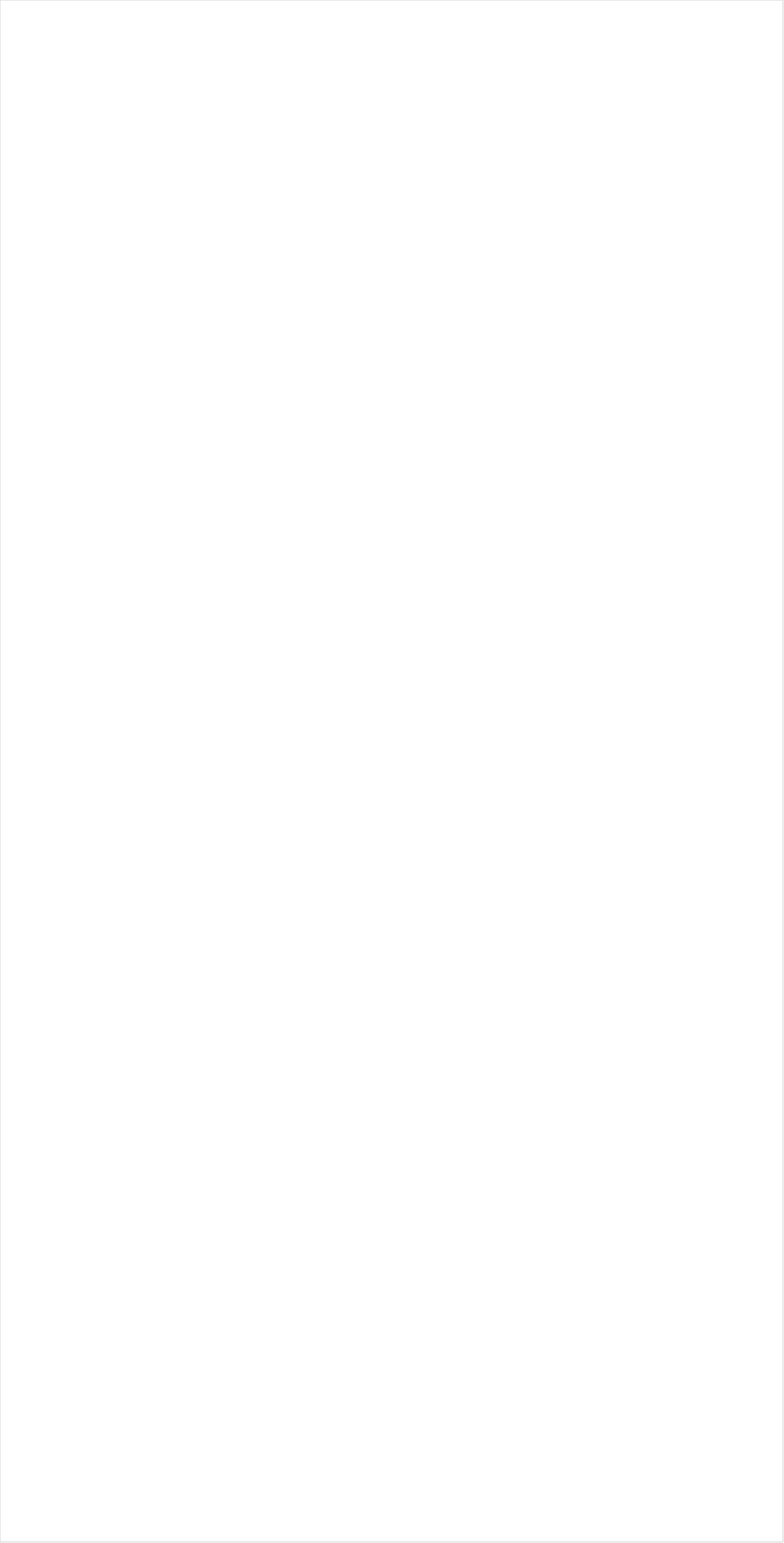
| Category | Total |
|---|---|
| Galavision | -0.932 |
| Telemundo | -0.908 |
| TUDN | -0.906 |
| UniMas | -0.892 |
| Univision | -0.822 |
| BET Her | -0.79 |
| NBC Universo | -0.774 |
| MTV2 | -0.754 |
| BET | -0.663 |
| TV ONE | -0.625 |
| MyNetworkTV | -0.579 |
| VH1 | -0.57 |
| NBA TV | -0.51 |
| Nick Toons | -0.495 |
| MSNBC | -0.455 |
| Nick Jr. | -0.441 |
| Oprah Winfrey Network | -0.439 |
| Universal Kids | -0.427 |
| Disney Channel | -0.423 |
| Cartoon Network | -0.42 |
| Adult Swim | -0.419 |
| Teen Nick | -0.419 |
| Lifetime Movies | -0.393 |
| Nick | -0.383 |
| CNN | -0.375 |
| ESPN Deportes | -0.334 |
| Nick@Nite | -0.333 |
| Disney XD | -0.314 |
| Disney Junior US | -0.31 |
| WE TV | -0.288 |
| BRAVO | -0.276 |
| TLC | -0.264 |
| FXX | -0.248 |
| Lifetime | -0.222 |
| E! | -0.206 |
| MTV | -0.151 |
| Comedy Central | -0.14 |
| Discovery Family Channel | -0.13 |
| SYFY | -0.104 |
| Freeform | -0.084 |
| Hallmark | -0.071 |
| Bloomberg HD | -0.069 |
| FX Movie Channel | -0.068 |
| Discovery Life Channel | -0.067 |
| OXYGEN | -0.065 |
| FX | -0.057 |
| HGTV | -0.055 |
| Logo | -0.044 |
| ION | -0.041 |
| Golf | -0.03 |
| Hallmark Movies & Mysteries | -0.024 |
| ESPN2 | -0.015 |
| Investigation Discovery | 0.008 |
| Game Show | 0.021 |
| Ovation | 0.031 |
| ESPN | 0.034 |
| BBC America | 0.034 |
| Viceland | 0.047 |
| POP | 0.064 |
| UP TV | 0.07 |
| ABC | 0.072 |
| CW | 0.072 |
| CNBC | 0.073 |
| PAC-12 Network | 0.074 |
| PBS | 0.085 |
| Reelz Channel | 0.097 |
| NFL Network | 0.1 |
| Travel | 0.1 |
| AMC | 0.103 |
| Tennis Channel | 0.109 |
| Food Network | 0.111 |
| Paramount Network | 0.114 |
| Cooking Channel | 0.134 |
| TNT | 0.185 |
| TBS | 0.186 |
| Headline News | 0.232 |
| National Geographic Wild | 0.237 |
| Olympic Channel | 0.238 |
| NBC | 0.242 |
| TV LAND | 0.243 |
| USA Network | 0.244 |
| Big Ten Network | 0.259 |
| American Heroes Channel | 0.275 |
| Fox Business | 0.279 |
| CMTV | 0.298 |
| Independent Film (IFC) | 0.316 |
| NHL | 0.317 |
| CBS | 0.319 |
| ESPNU | 0.319 |
| truTV | 0.329 |
| ESPNEWS | 0.341 |
| WGN America | 0.378 |
| Great American Country | 0.399 |
| Fox News | 0.414 |
| Destination America | 0.437 |
| SundanceTV | 0.442 |
| MLB Network | 0.461 |
| DIY | 0.468 |
| A&E | 0.469 |
| INSP | 0.489 |
| Smithsonian | 0.515 |
| National Geographic | 0.567 |
| Animal Planet | 0.574 |
| Science Channel | 0.579 |
| FYI | 0.631 |
| History Channel | 0.636 |
| NBC Sports | 0.707 |
| Weather Channel | 0.707 |
| Discovery Channel | 0.828 |
| The Sportsman Channel | 1.033 |
| Outdoor Channel | 1.267 |
| RFD TV | 1.351 |
| Motor Trend Network | 1.418 |
| CBS Sports | 1.465 |
| FOX | 2.026 |
| FOX Sports 2 | 4.058 |
| Fox Sports 1 | 7.455 |
| FXDEP | 8.43 |